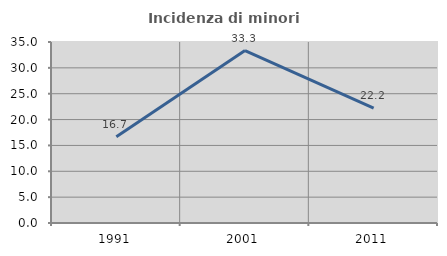
| Category | Incidenza di minori stranieri |
|---|---|
| 1991.0 | 16.667 |
| 2001.0 | 33.333 |
| 2011.0 | 22.222 |